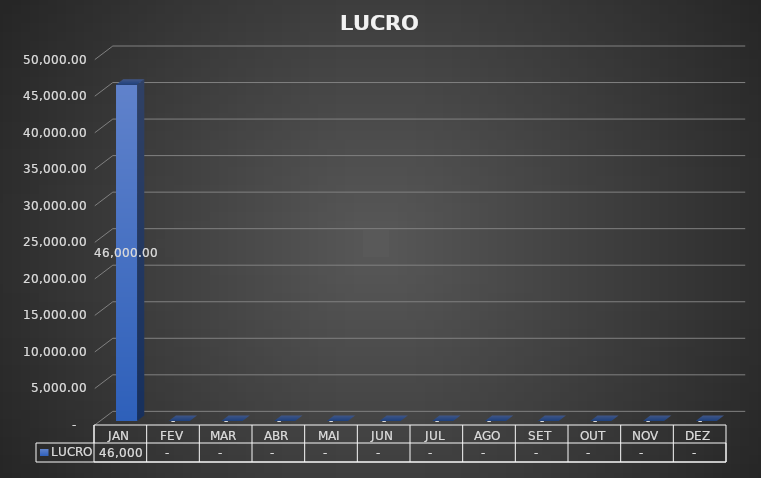
| Category | LUCRO |
|---|---|
| JAN | 46000 |
| FEV | 0 |
| MAR | 0 |
| ABR | 0 |
| MAI | 0 |
| JUN | 0 |
| JUL | 0 |
| AGO | 0 |
| SET | 0 |
| OUT | 0 |
| NOV | 0 |
| DEZ | 0 |